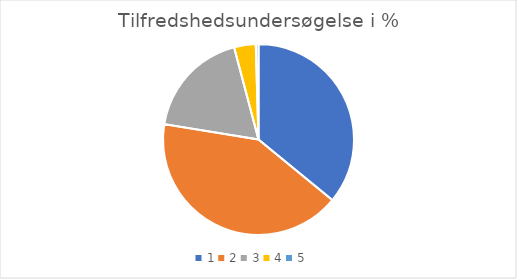
| Category | Series 0 |
|---|---|
| 0 | 0.359 |
| 1 | 0.416 |
| 2 | 0.183 |
| 3 | 0.037 |
| 4 | 0.005 |